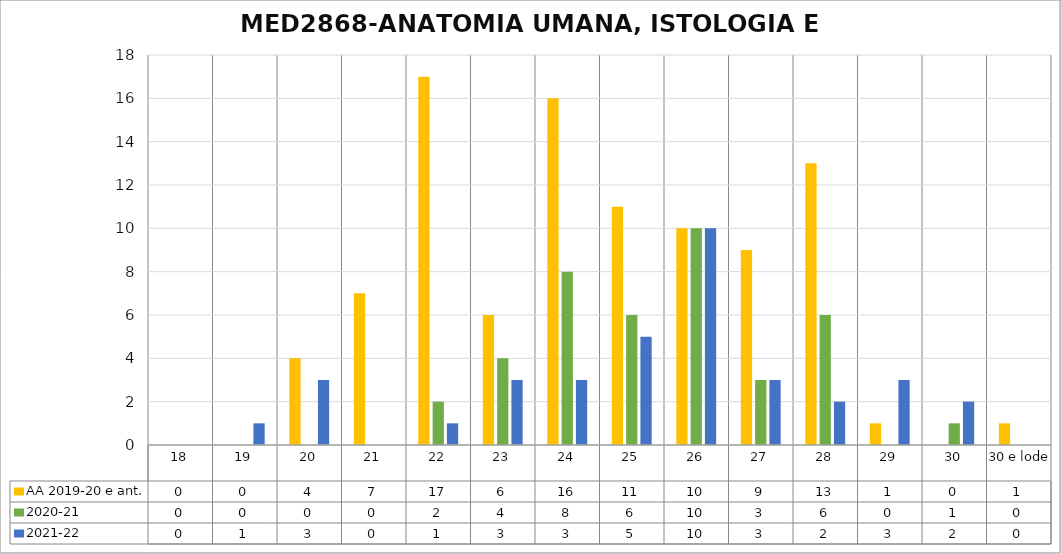
| Category | AA 2019-20 e ant. | 2020-21 | 2021-22 |
|---|---|---|---|
| 18 | 0 | 0 | 0 |
| 19 | 0 | 0 | 1 |
| 20 | 4 | 0 | 3 |
| 21 | 7 | 0 | 0 |
| 22 | 17 | 2 | 1 |
| 23 | 6 | 4 | 3 |
| 24 | 16 | 8 | 3 |
| 25 | 11 | 6 | 5 |
| 26 | 10 | 10 | 10 |
| 27 | 9 | 3 | 3 |
| 28 | 13 | 6 | 2 |
| 29 | 1 | 0 | 3 |
| 30 | 0 | 1 | 2 |
| 30 e lode | 1 | 0 | 0 |